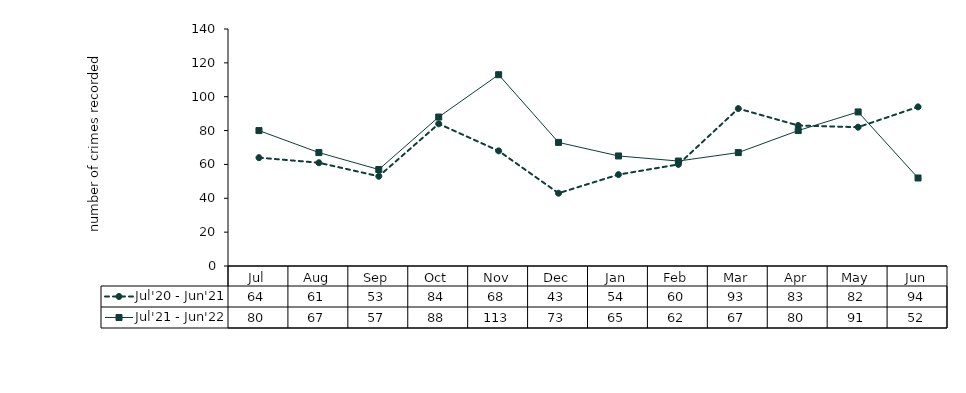
| Category | Jul'20 - Jun'21 | Jul'21 - Jun'22 |
|---|---|---|
| Jul | 64 | 80 |
| Aug | 61 | 67 |
| Sep | 53 | 57 |
| Oct | 84 | 88 |
| Nov | 68 | 113 |
| Dec | 43 | 73 |
| Jan | 54 | 65 |
| Feb | 60 | 62 |
| Mar | 93 | 67 |
| Apr | 83 | 80 |
| May | 82 | 91 |
| Jun | 94 | 52 |